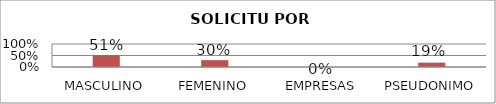
| Category | Series 1 |
|---|---|
| MASCULINO | 0.514 |
| FEMENINO | 0.297 |
| EMPRESAS | 0 |
| PSEUDONIMO | 0.189 |